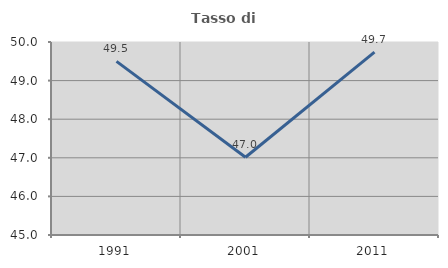
| Category | Tasso di occupazione   |
|---|---|
| 1991.0 | 49.497 |
| 2001.0 | 47.013 |
| 2011.0 | 49.738 |